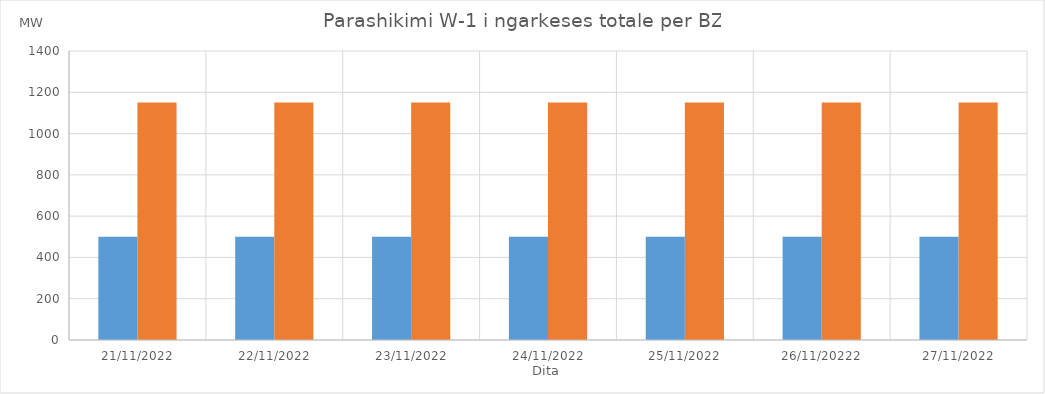
| Category | Min (MW) | Max (MW) |
|---|---|---|
| 21/11/2022 | 500 | 1150 |
| 22/11/2022 | 500 | 1150 |
| 23/11/2022 | 500 | 1150 |
| 24/11/2022 | 500 | 1150 |
| 25/11/2022 | 500 | 1150 |
| 26/11/20222 | 500 | 1150 |
| 27/11/2022 | 500 | 1150 |